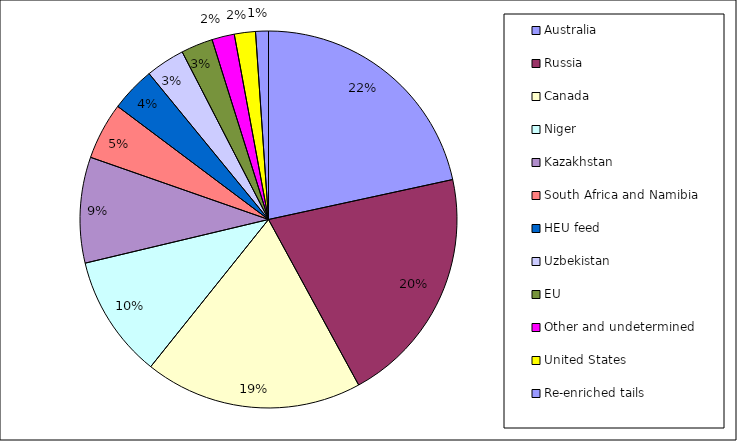
| Category | 2009 |
|---|---|
| Australia | 0.216 |
| Russia | 0.205 |
| Canada | 0.187 |
| Niger | 0.105 |
| Kazakhstan | 0.091 |
| South Africa and Namibia | 0.049 |
| HEU feed | 0.038 |
| Uzbekistan | 0.034 |
| EU | 0.027 |
| Other and undetermined | 0.019 |
| United States | 0.018 |
| Re-enriched tails | 0.011 |